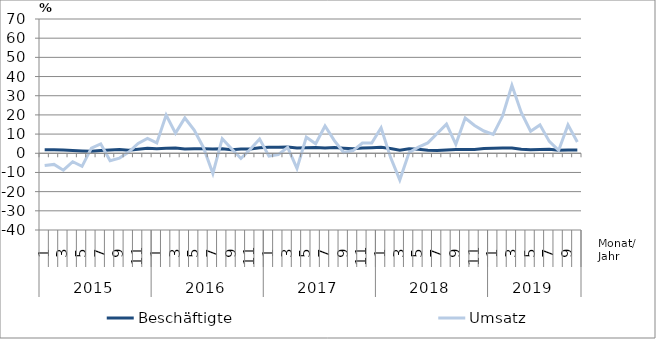
| Category | Beschäftigte | Umsatz |
|---|---|---|
| 0 | 1.8 | -6.4 |
| 1 | 1.8 | -5.8 |
| 2 | 1.7 | -8.8 |
| 3 | 1.5 | -4.4 |
| 4 | 1.2 | -6.8 |
| 5 | 1 | 2.7 |
| 6 | 1.4 | 4.9 |
| 7 | 1.7 | -3.9 |
| 8 | 2 | -2.5 |
| 9 | 1.6 | 0.6 |
| 10 | 2.1 | 5.1 |
| 11 | 2.6 | 7.7 |
| 12 | 2.4 | 5.4 |
| 13 | 2.6 | 19.9 |
| 14 | 2.7 | 10.5 |
| 15 | 2.2 | 18.4 |
| 16 | 2.3 | 12.1 |
| 17 | 2.3 | 2.9 |
| 18 | 2.2 | -10.5 |
| 19 | 2.4 | 7.6 |
| 20 | 1.8 | 2.4 |
| 21 | 2.2 | -2.7 |
| 22 | 2.2 | 2.1 |
| 23 | 2.9 | 7.4 |
| 24 | 3.2 | -1.5 |
| 25 | 3.2 | -0.7 |
| 26 | 3.3 | 3.1 |
| 27 | 2.7 | -7.9 |
| 28 | 2.9 | 8.4 |
| 29 | 3 | 5 |
| 30 | 2.8 | 14.2 |
| 31 | 3 | 6.6 |
| 32 | 2.6 | 0.4 |
| 33 | 2.3 | 1.4 |
| 34 | 2.7 | 5.3 |
| 35 | 2.9 | 5.4 |
| 36 | 3.1 | 13.3 |
| 37 | 2.5 | -2 |
| 38 | 1.6 | -13.9 |
| 39 | 2.4 | 0.4 |
| 40 | 2.1 | 3.2 |
| 41 | 1.6 | 5.4 |
| 42 | 1.5 | 10.3 |
| 43 | 1.7 | 15.2 |
| 44 | 2 | 4.7 |
| 45 | 2 | 18.4 |
| 46 | 2 | 14.5 |
| 47 | 2.5 | 11.6 |
| 48 | 2.6 | 9.8 |
| 49 | 2.8 | 19.4 |
| 50 | 2.8 | 35.4 |
| 51 | 2.1 | 21.3 |
| 52 | 1.8 | 11.5 |
| 53 | 2 | 14.8 |
| 54 | 2.1 | 6.2 |
| 55 | 1.6 | 1.5 |
| 56 | 1.7 | 14.8 |
| 57 | 1.7 | 5.9 |